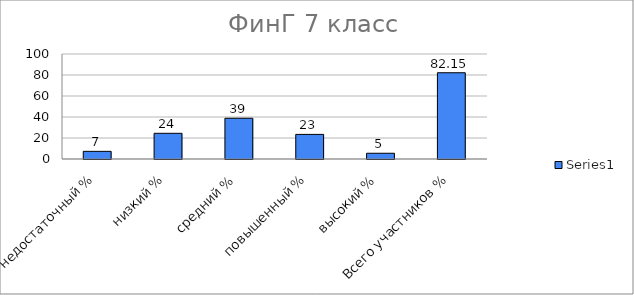
| Category | Series 0 |
|---|---|
| недостаточный % | 7.292 |
| низкий % | 24.479 |
| средний % | 38.802 |
| повышенный % | 23.438 |
| высокий % | 5.469 |
| Всего участников % | 82.151 |